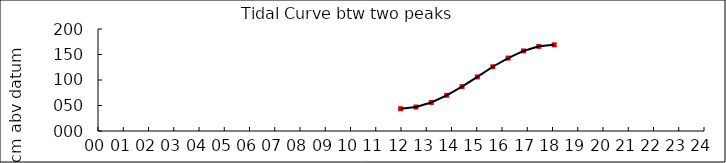
| Category | Height cm |
|---|---|
| 11.98333333333333 | 43.7 |
| 12.59166666666666 | 47 |
| 13.2 | 56 |
| 13.80833333333333 | 70 |
| 14.41666666666667 | 87 |
| 15.025 | 106 |
| 15.63333333333333 | 126 |
| 16.24166666666667 | 143 |
| 16.85 | 157 |
| 17.45833333333333 | 166 |
| 18.06666666666667 | 169 |